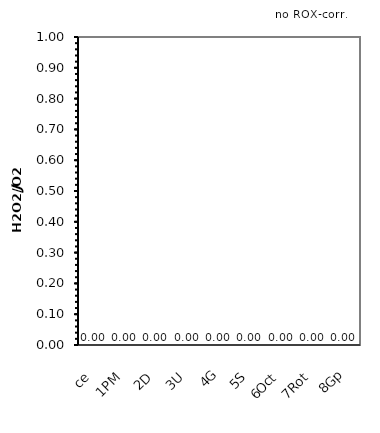
| Category | no ROX-corr. |
|---|---|
| ce | 0 |
| 1PM | 0 |
| 2D | 0 |
| 3U | 0 |
| 4G | 0 |
| 5S | 0 |
| 6Oct | 0 |
| 7Rot | 0 |
| 8Gp | 0 |